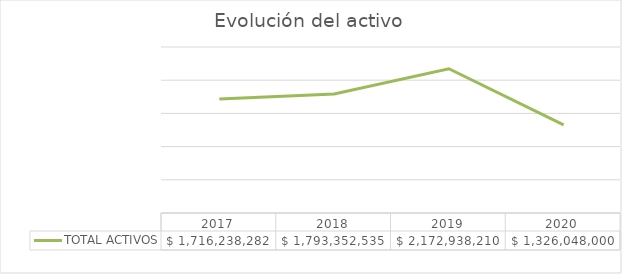
| Category | TOTAL ACTIVOS |
|---|---|
| 2017.0 | 1716238281.77 |
| 2018.0 | 1793352535.3 |
| 2019.0 | 2172938210 |
| 2020.0 | 1326048000 |